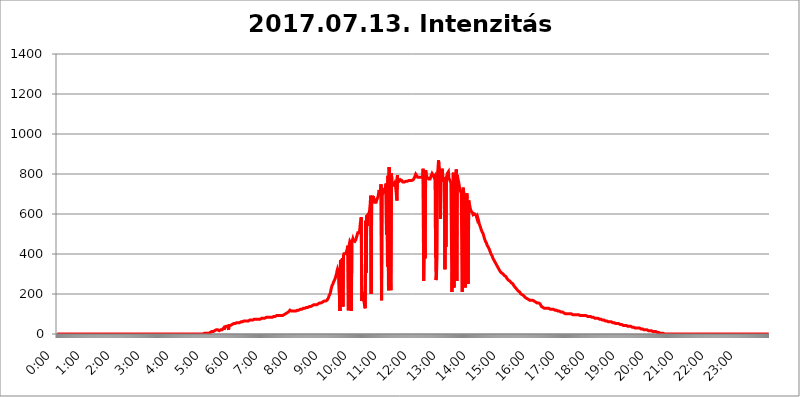
| Category | 2017.07.13. Intenzitás [W/m^2] |
|---|---|
| 0.0 | 0 |
| 0.0006944444444444445 | 0 |
| 0.001388888888888889 | 0 |
| 0.0020833333333333333 | 0 |
| 0.002777777777777778 | 0 |
| 0.003472222222222222 | 0 |
| 0.004166666666666667 | 0 |
| 0.004861111111111111 | 0 |
| 0.005555555555555556 | 0 |
| 0.0062499999999999995 | 0 |
| 0.006944444444444444 | 0 |
| 0.007638888888888889 | 0 |
| 0.008333333333333333 | 0 |
| 0.009027777777777779 | 0 |
| 0.009722222222222222 | 0 |
| 0.010416666666666666 | 0 |
| 0.011111111111111112 | 0 |
| 0.011805555555555555 | 0 |
| 0.012499999999999999 | 0 |
| 0.013194444444444444 | 0 |
| 0.013888888888888888 | 0 |
| 0.014583333333333332 | 0 |
| 0.015277777777777777 | 0 |
| 0.015972222222222224 | 0 |
| 0.016666666666666666 | 0 |
| 0.017361111111111112 | 0 |
| 0.018055555555555557 | 0 |
| 0.01875 | 0 |
| 0.019444444444444445 | 0 |
| 0.02013888888888889 | 0 |
| 0.020833333333333332 | 0 |
| 0.02152777777777778 | 0 |
| 0.022222222222222223 | 0 |
| 0.02291666666666667 | 0 |
| 0.02361111111111111 | 0 |
| 0.024305555555555556 | 0 |
| 0.024999999999999998 | 0 |
| 0.025694444444444447 | 0 |
| 0.02638888888888889 | 0 |
| 0.027083333333333334 | 0 |
| 0.027777777777777776 | 0 |
| 0.02847222222222222 | 0 |
| 0.029166666666666664 | 0 |
| 0.029861111111111113 | 0 |
| 0.030555555555555555 | 0 |
| 0.03125 | 0 |
| 0.03194444444444445 | 0 |
| 0.03263888888888889 | 0 |
| 0.03333333333333333 | 0 |
| 0.034027777777777775 | 0 |
| 0.034722222222222224 | 0 |
| 0.035416666666666666 | 0 |
| 0.036111111111111115 | 0 |
| 0.03680555555555556 | 0 |
| 0.0375 | 0 |
| 0.03819444444444444 | 0 |
| 0.03888888888888889 | 0 |
| 0.03958333333333333 | 0 |
| 0.04027777777777778 | 0 |
| 0.04097222222222222 | 0 |
| 0.041666666666666664 | 0 |
| 0.042361111111111106 | 0 |
| 0.04305555555555556 | 0 |
| 0.043750000000000004 | 0 |
| 0.044444444444444446 | 0 |
| 0.04513888888888889 | 0 |
| 0.04583333333333334 | 0 |
| 0.04652777777777778 | 0 |
| 0.04722222222222222 | 0 |
| 0.04791666666666666 | 0 |
| 0.04861111111111111 | 0 |
| 0.049305555555555554 | 0 |
| 0.049999999999999996 | 0 |
| 0.05069444444444445 | 0 |
| 0.051388888888888894 | 0 |
| 0.052083333333333336 | 0 |
| 0.05277777777777778 | 0 |
| 0.05347222222222222 | 0 |
| 0.05416666666666667 | 0 |
| 0.05486111111111111 | 0 |
| 0.05555555555555555 | 0 |
| 0.05625 | 0 |
| 0.05694444444444444 | 0 |
| 0.057638888888888885 | 0 |
| 0.05833333333333333 | 0 |
| 0.05902777777777778 | 0 |
| 0.059722222222222225 | 0 |
| 0.06041666666666667 | 0 |
| 0.061111111111111116 | 0 |
| 0.06180555555555556 | 0 |
| 0.0625 | 0 |
| 0.06319444444444444 | 0 |
| 0.06388888888888888 | 0 |
| 0.06458333333333334 | 0 |
| 0.06527777777777778 | 0 |
| 0.06597222222222222 | 0 |
| 0.06666666666666667 | 0 |
| 0.06736111111111111 | 0 |
| 0.06805555555555555 | 0 |
| 0.06874999999999999 | 0 |
| 0.06944444444444443 | 0 |
| 0.07013888888888889 | 0 |
| 0.07083333333333333 | 0 |
| 0.07152777777777779 | 0 |
| 0.07222222222222223 | 0 |
| 0.07291666666666667 | 0 |
| 0.07361111111111111 | 0 |
| 0.07430555555555556 | 0 |
| 0.075 | 0 |
| 0.07569444444444444 | 0 |
| 0.0763888888888889 | 0 |
| 0.07708333333333334 | 0 |
| 0.07777777777777778 | 0 |
| 0.07847222222222222 | 0 |
| 0.07916666666666666 | 0 |
| 0.0798611111111111 | 0 |
| 0.08055555555555556 | 0 |
| 0.08125 | 0 |
| 0.08194444444444444 | 0 |
| 0.08263888888888889 | 0 |
| 0.08333333333333333 | 0 |
| 0.08402777777777777 | 0 |
| 0.08472222222222221 | 0 |
| 0.08541666666666665 | 0 |
| 0.08611111111111112 | 0 |
| 0.08680555555555557 | 0 |
| 0.08750000000000001 | 0 |
| 0.08819444444444445 | 0 |
| 0.08888888888888889 | 0 |
| 0.08958333333333333 | 0 |
| 0.09027777777777778 | 0 |
| 0.09097222222222222 | 0 |
| 0.09166666666666667 | 0 |
| 0.09236111111111112 | 0 |
| 0.09305555555555556 | 0 |
| 0.09375 | 0 |
| 0.09444444444444444 | 0 |
| 0.09513888888888888 | 0 |
| 0.09583333333333333 | 0 |
| 0.09652777777777777 | 0 |
| 0.09722222222222222 | 0 |
| 0.09791666666666667 | 0 |
| 0.09861111111111111 | 0 |
| 0.09930555555555555 | 0 |
| 0.09999999999999999 | 0 |
| 0.10069444444444443 | 0 |
| 0.1013888888888889 | 0 |
| 0.10208333333333335 | 0 |
| 0.10277777777777779 | 0 |
| 0.10347222222222223 | 0 |
| 0.10416666666666667 | 0 |
| 0.10486111111111111 | 0 |
| 0.10555555555555556 | 0 |
| 0.10625 | 0 |
| 0.10694444444444444 | 0 |
| 0.1076388888888889 | 0 |
| 0.10833333333333334 | 0 |
| 0.10902777777777778 | 0 |
| 0.10972222222222222 | 0 |
| 0.1111111111111111 | 0 |
| 0.11180555555555556 | 0 |
| 0.11180555555555556 | 0 |
| 0.1125 | 0 |
| 0.11319444444444444 | 0 |
| 0.11388888888888889 | 0 |
| 0.11458333333333333 | 0 |
| 0.11527777777777777 | 0 |
| 0.11597222222222221 | 0 |
| 0.11666666666666665 | 0 |
| 0.1173611111111111 | 0 |
| 0.11805555555555557 | 0 |
| 0.11944444444444445 | 0 |
| 0.12013888888888889 | 0 |
| 0.12083333333333333 | 0 |
| 0.12152777777777778 | 0 |
| 0.12222222222222223 | 0 |
| 0.12291666666666667 | 0 |
| 0.12291666666666667 | 0 |
| 0.12361111111111112 | 0 |
| 0.12430555555555556 | 0 |
| 0.125 | 0 |
| 0.12569444444444444 | 0 |
| 0.12638888888888888 | 0 |
| 0.12708333333333333 | 0 |
| 0.16875 | 0 |
| 0.12847222222222224 | 0 |
| 0.12916666666666668 | 0 |
| 0.12986111111111112 | 0 |
| 0.13055555555555556 | 0 |
| 0.13125 | 0 |
| 0.13194444444444445 | 0 |
| 0.1326388888888889 | 0 |
| 0.13333333333333333 | 0 |
| 0.13402777777777777 | 0 |
| 0.13402777777777777 | 0 |
| 0.13472222222222222 | 0 |
| 0.13541666666666666 | 0 |
| 0.1361111111111111 | 0 |
| 0.13749999999999998 | 0 |
| 0.13819444444444443 | 0 |
| 0.1388888888888889 | 0 |
| 0.13958333333333334 | 0 |
| 0.14027777777777778 | 0 |
| 0.14097222222222222 | 0 |
| 0.14166666666666666 | 0 |
| 0.1423611111111111 | 0 |
| 0.14305555555555557 | 0 |
| 0.14375000000000002 | 0 |
| 0.14444444444444446 | 0 |
| 0.1451388888888889 | 0 |
| 0.1451388888888889 | 0 |
| 0.14652777777777778 | 0 |
| 0.14722222222222223 | 0 |
| 0.14791666666666667 | 0 |
| 0.1486111111111111 | 0 |
| 0.14930555555555555 | 0 |
| 0.15 | 0 |
| 0.15069444444444444 | 0 |
| 0.15138888888888888 | 0 |
| 0.15208333333333332 | 0 |
| 0.15277777777777776 | 0 |
| 0.15347222222222223 | 0 |
| 0.15416666666666667 | 0 |
| 0.15486111111111112 | 0 |
| 0.15555555555555556 | 0 |
| 0.15625 | 0 |
| 0.15694444444444444 | 0 |
| 0.15763888888888888 | 0 |
| 0.15833333333333333 | 0 |
| 0.15902777777777777 | 0 |
| 0.15972222222222224 | 0 |
| 0.16041666666666668 | 0 |
| 0.16111111111111112 | 0 |
| 0.16180555555555556 | 0 |
| 0.1625 | 0 |
| 0.16319444444444445 | 0 |
| 0.1638888888888889 | 0 |
| 0.16458333333333333 | 0 |
| 0.16527777777777777 | 0 |
| 0.16597222222222222 | 0 |
| 0.16666666666666666 | 0 |
| 0.1673611111111111 | 0 |
| 0.16805555555555554 | 0 |
| 0.16874999999999998 | 0 |
| 0.16944444444444443 | 0 |
| 0.17013888888888887 | 0 |
| 0.1708333333333333 | 0 |
| 0.17152777777777775 | 0 |
| 0.17222222222222225 | 0 |
| 0.1729166666666667 | 0 |
| 0.17361111111111113 | 0 |
| 0.17430555555555557 | 0 |
| 0.17500000000000002 | 0 |
| 0.17569444444444446 | 0 |
| 0.1763888888888889 | 0 |
| 0.17708333333333334 | 0 |
| 0.17777777777777778 | 0 |
| 0.17847222222222223 | 0 |
| 0.17916666666666667 | 0 |
| 0.1798611111111111 | 0 |
| 0.18055555555555555 | 0 |
| 0.18125 | 0 |
| 0.18194444444444444 | 0 |
| 0.1826388888888889 | 0 |
| 0.18333333333333335 | 0 |
| 0.1840277777777778 | 0 |
| 0.18472222222222223 | 0 |
| 0.18541666666666667 | 0 |
| 0.18611111111111112 | 0 |
| 0.18680555555555556 | 0 |
| 0.1875 | 0 |
| 0.18819444444444444 | 0 |
| 0.18888888888888888 | 0 |
| 0.18958333333333333 | 0 |
| 0.19027777777777777 | 0 |
| 0.1909722222222222 | 0 |
| 0.19166666666666665 | 0 |
| 0.19236111111111112 | 0 |
| 0.19305555555555554 | 0 |
| 0.19375 | 0 |
| 0.19444444444444445 | 0 |
| 0.1951388888888889 | 0 |
| 0.19583333333333333 | 0 |
| 0.19652777777777777 | 0 |
| 0.19722222222222222 | 0 |
| 0.19791666666666666 | 0 |
| 0.1986111111111111 | 0 |
| 0.19930555555555554 | 0 |
| 0.19999999999999998 | 0 |
| 0.20069444444444443 | 0 |
| 0.20138888888888887 | 0 |
| 0.2020833333333333 | 0 |
| 0.2027777777777778 | 0 |
| 0.2034722222222222 | 0 |
| 0.2041666666666667 | 0 |
| 0.20486111111111113 | 0 |
| 0.20555555555555557 | 3.525 |
| 0.20625000000000002 | 3.525 |
| 0.20694444444444446 | 3.525 |
| 0.2076388888888889 | 3.525 |
| 0.20833333333333334 | 3.525 |
| 0.20902777777777778 | 3.525 |
| 0.20972222222222223 | 3.525 |
| 0.21041666666666667 | 3.525 |
| 0.2111111111111111 | 3.525 |
| 0.21180555555555555 | 3.525 |
| 0.2125 | 3.525 |
| 0.21319444444444444 | 7.887 |
| 0.2138888888888889 | 7.887 |
| 0.21458333333333335 | 7.887 |
| 0.2152777777777778 | 7.887 |
| 0.21597222222222223 | 12.257 |
| 0.21666666666666667 | 12.257 |
| 0.21736111111111112 | 12.257 |
| 0.21805555555555556 | 12.257 |
| 0.21875 | 12.257 |
| 0.21944444444444444 | 16.636 |
| 0.22013888888888888 | 16.636 |
| 0.22083333333333333 | 16.636 |
| 0.22152777777777777 | 21.024 |
| 0.2222222222222222 | 21.024 |
| 0.22291666666666665 | 21.024 |
| 0.2236111111111111 | 21.024 |
| 0.22430555555555556 | 21.024 |
| 0.225 | 21.024 |
| 0.22569444444444445 | 16.636 |
| 0.2263888888888889 | 16.636 |
| 0.22708333333333333 | 16.636 |
| 0.22777777777777777 | 16.636 |
| 0.22847222222222222 | 16.636 |
| 0.22916666666666666 | 21.024 |
| 0.2298611111111111 | 16.636 |
| 0.23055555555555554 | 16.636 |
| 0.23124999999999998 | 21.024 |
| 0.23194444444444443 | 21.024 |
| 0.23263888888888887 | 21.024 |
| 0.2333333333333333 | 29.823 |
| 0.2340277777777778 | 21.024 |
| 0.2347222222222222 | 34.234 |
| 0.2354166666666667 | 29.823 |
| 0.23611111111111113 | 29.823 |
| 0.23680555555555557 | 38.653 |
| 0.23750000000000002 | 38.653 |
| 0.23819444444444446 | 38.653 |
| 0.2388888888888889 | 38.653 |
| 0.23958333333333334 | 38.653 |
| 0.24027777777777778 | 21.024 |
| 0.24097222222222223 | 43.079 |
| 0.24166666666666667 | 43.079 |
| 0.2423611111111111 | 47.511 |
| 0.24305555555555555 | 43.079 |
| 0.24375 | 47.511 |
| 0.24444444444444446 | 47.511 |
| 0.24513888888888888 | 47.511 |
| 0.24583333333333335 | 47.511 |
| 0.2465277777777778 | 47.511 |
| 0.24722222222222223 | 51.951 |
| 0.24791666666666667 | 51.951 |
| 0.24861111111111112 | 51.951 |
| 0.24930555555555556 | 51.951 |
| 0.25 | 51.951 |
| 0.25069444444444444 | 56.398 |
| 0.2513888888888889 | 56.398 |
| 0.2520833333333333 | 56.398 |
| 0.25277777777777777 | 56.398 |
| 0.2534722222222222 | 56.398 |
| 0.25416666666666665 | 56.398 |
| 0.2548611111111111 | 56.398 |
| 0.2555555555555556 | 56.398 |
| 0.25625000000000003 | 60.85 |
| 0.2569444444444445 | 60.85 |
| 0.2576388888888889 | 60.85 |
| 0.25833333333333336 | 60.85 |
| 0.2590277777777778 | 60.85 |
| 0.25972222222222224 | 60.85 |
| 0.2604166666666667 | 65.31 |
| 0.2611111111111111 | 65.31 |
| 0.26180555555555557 | 65.31 |
| 0.2625 | 65.31 |
| 0.26319444444444445 | 65.31 |
| 0.2638888888888889 | 65.31 |
| 0.26458333333333334 | 65.31 |
| 0.2652777777777778 | 65.31 |
| 0.2659722222222222 | 65.31 |
| 0.26666666666666666 | 65.31 |
| 0.2673611111111111 | 65.31 |
| 0.26805555555555555 | 65.31 |
| 0.26875 | 65.31 |
| 0.26944444444444443 | 65.31 |
| 0.2701388888888889 | 69.775 |
| 0.2708333333333333 | 69.775 |
| 0.27152777777777776 | 69.775 |
| 0.2722222222222222 | 69.775 |
| 0.27291666666666664 | 69.775 |
| 0.2736111111111111 | 69.775 |
| 0.2743055555555555 | 69.775 |
| 0.27499999999999997 | 69.775 |
| 0.27569444444444446 | 69.775 |
| 0.27638888888888885 | 74.246 |
| 0.27708333333333335 | 74.246 |
| 0.2777777777777778 | 74.246 |
| 0.27847222222222223 | 74.246 |
| 0.2791666666666667 | 74.246 |
| 0.2798611111111111 | 74.246 |
| 0.28055555555555556 | 74.246 |
| 0.28125 | 74.246 |
| 0.28194444444444444 | 74.246 |
| 0.2826388888888889 | 74.246 |
| 0.2833333333333333 | 74.246 |
| 0.28402777777777777 | 74.246 |
| 0.2847222222222222 | 74.246 |
| 0.28541666666666665 | 78.722 |
| 0.28611111111111115 | 78.722 |
| 0.28680555555555554 | 78.722 |
| 0.28750000000000003 | 78.722 |
| 0.2881944444444445 | 78.722 |
| 0.2888888888888889 | 78.722 |
| 0.28958333333333336 | 78.722 |
| 0.2902777777777778 | 78.722 |
| 0.29097222222222224 | 78.722 |
| 0.2916666666666667 | 78.722 |
| 0.2923611111111111 | 83.205 |
| 0.29305555555555557 | 83.205 |
| 0.29375 | 83.205 |
| 0.29444444444444445 | 83.205 |
| 0.2951388888888889 | 83.205 |
| 0.29583333333333334 | 83.205 |
| 0.2965277777777778 | 83.205 |
| 0.2972222222222222 | 83.205 |
| 0.29791666666666666 | 83.205 |
| 0.2986111111111111 | 83.205 |
| 0.29930555555555555 | 83.205 |
| 0.3 | 83.205 |
| 0.30069444444444443 | 83.205 |
| 0.3013888888888889 | 83.205 |
| 0.3020833333333333 | 87.692 |
| 0.30277777777777776 | 83.205 |
| 0.3034722222222222 | 87.692 |
| 0.30416666666666664 | 87.692 |
| 0.3048611111111111 | 87.692 |
| 0.3055555555555555 | 87.692 |
| 0.30624999999999997 | 87.692 |
| 0.3069444444444444 | 92.184 |
| 0.3076388888888889 | 92.184 |
| 0.30833333333333335 | 92.184 |
| 0.3090277777777778 | 92.184 |
| 0.30972222222222223 | 92.184 |
| 0.3104166666666667 | 92.184 |
| 0.3111111111111111 | 92.184 |
| 0.31180555555555556 | 92.184 |
| 0.3125 | 92.184 |
| 0.31319444444444444 | 92.184 |
| 0.3138888888888889 | 92.184 |
| 0.3145833333333333 | 92.184 |
| 0.31527777777777777 | 96.682 |
| 0.3159722222222222 | 92.184 |
| 0.31666666666666665 | 96.682 |
| 0.31736111111111115 | 96.682 |
| 0.31805555555555554 | 96.682 |
| 0.31875000000000003 | 101.184 |
| 0.3194444444444445 | 101.184 |
| 0.3201388888888889 | 101.184 |
| 0.32083333333333336 | 101.184 |
| 0.3215277777777778 | 105.69 |
| 0.32222222222222224 | 105.69 |
| 0.3229166666666667 | 105.69 |
| 0.3236111111111111 | 110.201 |
| 0.32430555555555557 | 110.201 |
| 0.325 | 110.201 |
| 0.32569444444444445 | 110.201 |
| 0.3263888888888889 | 119.235 |
| 0.32708333333333334 | 123.758 |
| 0.3277777777777778 | 123.758 |
| 0.3284722222222222 | 114.716 |
| 0.32916666666666666 | 114.716 |
| 0.3298611111111111 | 114.716 |
| 0.33055555555555555 | 114.716 |
| 0.33125 | 114.716 |
| 0.33194444444444443 | 114.716 |
| 0.3326388888888889 | 114.716 |
| 0.3333333333333333 | 114.716 |
| 0.3340277777777778 | 114.716 |
| 0.3347222222222222 | 114.716 |
| 0.3354166666666667 | 119.235 |
| 0.3361111111111111 | 119.235 |
| 0.3368055555555556 | 119.235 |
| 0.33749999999999997 | 119.235 |
| 0.33819444444444446 | 119.235 |
| 0.33888888888888885 | 119.235 |
| 0.33958333333333335 | 119.235 |
| 0.34027777777777773 | 123.758 |
| 0.34097222222222223 | 123.758 |
| 0.3416666666666666 | 123.758 |
| 0.3423611111111111 | 123.758 |
| 0.3430555555555555 | 123.758 |
| 0.34375 | 128.284 |
| 0.3444444444444445 | 128.284 |
| 0.3451388888888889 | 128.284 |
| 0.3458333333333334 | 128.284 |
| 0.34652777777777777 | 128.284 |
| 0.34722222222222227 | 128.284 |
| 0.34791666666666665 | 128.284 |
| 0.34861111111111115 | 132.814 |
| 0.34930555555555554 | 132.814 |
| 0.35000000000000003 | 132.814 |
| 0.3506944444444444 | 132.814 |
| 0.3513888888888889 | 132.814 |
| 0.3520833333333333 | 137.347 |
| 0.3527777777777778 | 137.347 |
| 0.3534722222222222 | 137.347 |
| 0.3541666666666667 | 137.347 |
| 0.3548611111111111 | 137.347 |
| 0.35555555555555557 | 137.347 |
| 0.35625 | 141.884 |
| 0.35694444444444445 | 141.884 |
| 0.3576388888888889 | 141.884 |
| 0.35833333333333334 | 141.884 |
| 0.3590277777777778 | 146.423 |
| 0.3597222222222222 | 146.423 |
| 0.36041666666666666 | 146.423 |
| 0.3611111111111111 | 146.423 |
| 0.36180555555555555 | 146.423 |
| 0.3625 | 146.423 |
| 0.36319444444444443 | 146.423 |
| 0.3638888888888889 | 146.423 |
| 0.3645833333333333 | 150.964 |
| 0.3652777777777778 | 150.964 |
| 0.3659722222222222 | 150.964 |
| 0.3666666666666667 | 155.509 |
| 0.3673611111111111 | 150.964 |
| 0.3680555555555556 | 155.509 |
| 0.36874999999999997 | 155.509 |
| 0.36944444444444446 | 155.509 |
| 0.37013888888888885 | 155.509 |
| 0.37083333333333335 | 160.056 |
| 0.37152777777777773 | 160.056 |
| 0.37222222222222223 | 160.056 |
| 0.3729166666666666 | 160.056 |
| 0.3736111111111111 | 160.056 |
| 0.3743055555555555 | 164.605 |
| 0.375 | 164.605 |
| 0.3756944444444445 | 164.605 |
| 0.3763888888888889 | 164.605 |
| 0.3770833333333334 | 164.605 |
| 0.37777777777777777 | 169.156 |
| 0.37847222222222227 | 169.156 |
| 0.37916666666666665 | 169.156 |
| 0.37986111111111115 | 173.709 |
| 0.38055555555555554 | 182.82 |
| 0.38125000000000003 | 191.937 |
| 0.3819444444444444 | 191.937 |
| 0.3826388888888889 | 201.058 |
| 0.3833333333333333 | 210.182 |
| 0.3840277777777778 | 223.873 |
| 0.3847222222222222 | 233 |
| 0.3854166666666667 | 242.127 |
| 0.3861111111111111 | 242.127 |
| 0.38680555555555557 | 251.251 |
| 0.3875 | 260.373 |
| 0.38819444444444445 | 264.932 |
| 0.3888888888888889 | 269.49 |
| 0.38958333333333334 | 274.047 |
| 0.3902777777777778 | 283.156 |
| 0.3909722222222222 | 287.709 |
| 0.39166666666666666 | 301.354 |
| 0.3923611111111111 | 314.98 |
| 0.39305555555555555 | 324.052 |
| 0.39375 | 314.98 |
| 0.39444444444444443 | 328.584 |
| 0.3951388888888889 | 328.584 |
| 0.3958333333333333 | 328.584 |
| 0.3965277777777778 | 114.716 |
| 0.3972222222222222 | 364.728 |
| 0.3979166666666667 | 364.728 |
| 0.3986111111111111 | 360.221 |
| 0.3993055555555556 | 369.23 |
| 0.39999999999999997 | 378.224 |
| 0.40069444444444446 | 137.347 |
| 0.40138888888888885 | 391.685 |
| 0.40208333333333335 | 400.638 |
| 0.40277777777777773 | 396.164 |
| 0.40347222222222223 | 396.164 |
| 0.4041666666666666 | 400.638 |
| 0.4048611111111111 | 405.108 |
| 0.4055555555555555 | 409.574 |
| 0.40625 | 414.035 |
| 0.4069444444444445 | 414.035 |
| 0.4076388888888889 | 440.702 |
| 0.4083333333333334 | 119.235 |
| 0.40902777777777777 | 436.27 |
| 0.40972222222222227 | 449.551 |
| 0.41041666666666665 | 462.786 |
| 0.41111111111111115 | 462.786 |
| 0.41180555555555554 | 453.968 |
| 0.41250000000000003 | 114.716 |
| 0.4131944444444444 | 458.38 |
| 0.4138888888888889 | 467.187 |
| 0.4145833333333333 | 475.972 |
| 0.4152777777777778 | 467.187 |
| 0.4159722222222222 | 462.786 |
| 0.4166666666666667 | 462.786 |
| 0.4173611111111111 | 462.786 |
| 0.41805555555555557 | 467.187 |
| 0.41875 | 471.582 |
| 0.41944444444444445 | 475.972 |
| 0.4201388888888889 | 475.972 |
| 0.42083333333333334 | 497.836 |
| 0.4215277777777778 | 506.542 |
| 0.4222222222222222 | 510.885 |
| 0.42291666666666666 | 506.542 |
| 0.4236111111111111 | 506.542 |
| 0.42430555555555555 | 523.88 |
| 0.425 | 553.986 |
| 0.42569444444444443 | 566.793 |
| 0.4263888888888889 | 583.779 |
| 0.4270833333333333 | 164.605 |
| 0.4277777777777778 | 187.378 |
| 0.4284722222222222 | 210.182 |
| 0.4291666666666667 | 196.497 |
| 0.4298611111111111 | 173.709 |
| 0.4305555555555556 | 155.509 |
| 0.43124999999999997 | 137.347 |
| 0.43194444444444446 | 128.284 |
| 0.43263888888888885 | 566.793 |
| 0.43333333333333335 | 305.898 |
| 0.43402777777777773 | 592.233 |
| 0.43472222222222223 | 541.121 |
| 0.4354166666666666 | 596.45 |
| 0.4361111111111111 | 596.45 |
| 0.4368055555555555 | 600.661 |
| 0.4375 | 604.864 |
| 0.4381944444444445 | 621.613 |
| 0.4388888888888889 | 650.667 |
| 0.4395833333333334 | 691.608 |
| 0.44027777777777777 | 201.058 |
| 0.44097222222222227 | 667.123 |
| 0.44166666666666665 | 691.608 |
| 0.44236111111111115 | 654.791 |
| 0.44305555555555554 | 687.544 |
| 0.44375000000000003 | 683.473 |
| 0.4444444444444444 | 671.22 |
| 0.4451388888888889 | 658.909 |
| 0.4458333333333333 | 658.909 |
| 0.4465277777777778 | 658.909 |
| 0.4472222222222222 | 658.909 |
| 0.4479166666666667 | 663.019 |
| 0.4486111111111111 | 675.311 |
| 0.44930555555555557 | 679.395 |
| 0.45 | 687.544 |
| 0.45069444444444445 | 703.762 |
| 0.4513888888888889 | 719.877 |
| 0.45208333333333334 | 711.832 |
| 0.4527777777777778 | 719.877 |
| 0.4534722222222222 | 695.666 |
| 0.45416666666666666 | 747.834 |
| 0.4548611111111111 | 169.156 |
| 0.45555555555555555 | 727.896 |
| 0.45625 | 715.858 |
| 0.45694444444444443 | 711.832 |
| 0.4576388888888889 | 707.8 |
| 0.4583333333333333 | 707.8 |
| 0.4590277777777778 | 719.877 |
| 0.4597222222222222 | 723.889 |
| 0.4604166666666667 | 735.89 |
| 0.4611111111111111 | 751.803 |
| 0.4618055555555556 | 497.836 |
| 0.46249999999999997 | 751.803 |
| 0.46319444444444446 | 337.639 |
| 0.46388888888888885 | 791.169 |
| 0.46458333333333335 | 219.309 |
| 0.46527777777777773 | 833.834 |
| 0.46597222222222223 | 822.26 |
| 0.4666666666666666 | 287.709 |
| 0.4673611111111111 | 260.373 |
| 0.4680555555555555 | 219.309 |
| 0.46875 | 802.868 |
| 0.4694444444444445 | 755.766 |
| 0.4701388888888889 | 747.834 |
| 0.4708333333333334 | 743.859 |
| 0.47152777777777777 | 743.859 |
| 0.47222222222222227 | 743.859 |
| 0.47291666666666665 | 743.859 |
| 0.47361111111111115 | 755.766 |
| 0.47430555555555554 | 747.834 |
| 0.47500000000000003 | 751.803 |
| 0.4756944444444444 | 751.803 |
| 0.4763888888888889 | 667.123 |
| 0.4770833333333333 | 795.074 |
| 0.4777777777777778 | 759.723 |
| 0.4784722222222222 | 759.723 |
| 0.4791666666666667 | 759.723 |
| 0.4798611111111111 | 763.674 |
| 0.48055555555555557 | 767.62 |
| 0.48125 | 771.559 |
| 0.48194444444444445 | 771.559 |
| 0.4826388888888889 | 767.62 |
| 0.48333333333333334 | 767.62 |
| 0.4840277777777778 | 763.674 |
| 0.4847222222222222 | 759.723 |
| 0.48541666666666666 | 759.723 |
| 0.4861111111111111 | 759.723 |
| 0.48680555555555555 | 759.723 |
| 0.4875 | 759.723 |
| 0.48819444444444443 | 763.674 |
| 0.4888888888888889 | 763.674 |
| 0.4895833333333333 | 763.674 |
| 0.4902777777777778 | 767.62 |
| 0.4909722222222222 | 763.674 |
| 0.4916666666666667 | 767.62 |
| 0.4923611111111111 | 767.62 |
| 0.4930555555555556 | 767.62 |
| 0.49374999999999997 | 767.62 |
| 0.49444444444444446 | 767.62 |
| 0.49513888888888885 | 767.62 |
| 0.49583333333333335 | 767.62 |
| 0.49652777777777773 | 767.62 |
| 0.49722222222222223 | 767.62 |
| 0.4979166666666666 | 767.62 |
| 0.4986111111111111 | 767.62 |
| 0.4993055555555555 | 771.559 |
| 0.5 | 775.492 |
| 0.5006944444444444 | 779.42 |
| 0.5013888888888889 | 775.492 |
| 0.5020833333333333 | 783.342 |
| 0.5027777777777778 | 798.974 |
| 0.5034722222222222 | 795.074 |
| 0.5041666666666667 | 791.169 |
| 0.5048611111111111 | 787.258 |
| 0.5055555555555555 | 783.342 |
| 0.50625 | 783.342 |
| 0.5069444444444444 | 783.342 |
| 0.5076388888888889 | 783.342 |
| 0.5083333333333333 | 783.342 |
| 0.5090277777777777 | 779.42 |
| 0.5097222222222222 | 783.342 |
| 0.5104166666666666 | 779.42 |
| 0.5111111111111112 | 779.42 |
| 0.5118055555555555 | 783.342 |
| 0.5125000000000001 | 791.169 |
| 0.5131944444444444 | 826.123 |
| 0.513888888888889 | 264.932 |
| 0.5145833333333333 | 436.27 |
| 0.5152777777777778 | 497.836 |
| 0.5159722222222222 | 378.224 |
| 0.5166666666666667 | 818.392 |
| 0.517361111111111 | 798.974 |
| 0.5180555555555556 | 791.169 |
| 0.5187499999999999 | 783.342 |
| 0.5194444444444445 | 779.42 |
| 0.5201388888888888 | 779.42 |
| 0.5208333333333334 | 775.492 |
| 0.5215277777777778 | 775.492 |
| 0.5222222222222223 | 775.492 |
| 0.5229166666666667 | 775.492 |
| 0.5236111111111111 | 779.42 |
| 0.5243055555555556 | 791.169 |
| 0.525 | 795.074 |
| 0.5256944444444445 | 802.868 |
| 0.5263888888888889 | 798.974 |
| 0.5270833333333333 | 795.074 |
| 0.5277777777777778 | 791.169 |
| 0.5284722222222222 | 783.342 |
| 0.5291666666666667 | 779.42 |
| 0.5298611111111111 | 791.169 |
| 0.5305555555555556 | 409.574 |
| 0.53125 | 269.49 |
| 0.5319444444444444 | 296.808 |
| 0.5326388888888889 | 387.202 |
| 0.5333333333333333 | 795.074 |
| 0.5340277777777778 | 829.981 |
| 0.5347222222222222 | 868.305 |
| 0.5354166666666667 | 849.199 |
| 0.5361111111111111 | 822.26 |
| 0.5368055555555555 | 806.757 |
| 0.5375 | 575.299 |
| 0.5381944444444444 | 802.868 |
| 0.5388888888888889 | 759.723 |
| 0.5395833333333333 | 826.123 |
| 0.5402777777777777 | 806.757 |
| 0.5409722222222222 | 783.342 |
| 0.5416666666666666 | 775.492 |
| 0.5423611111111112 | 767.62 |
| 0.5430555555555555 | 783.342 |
| 0.5437500000000001 | 324.052 |
| 0.5444444444444444 | 775.492 |
| 0.545138888888889 | 436.27 |
| 0.5458333333333333 | 783.342 |
| 0.5465277777777778 | 791.169 |
| 0.5472222222222222 | 802.868 |
| 0.5479166666666667 | 798.974 |
| 0.548611111111111 | 810.641 |
| 0.5493055555555556 | 779.42 |
| 0.5499999999999999 | 775.492 |
| 0.5506944444444445 | 767.62 |
| 0.5513888888888888 | 763.674 |
| 0.5520833333333334 | 755.766 |
| 0.5527777777777778 | 751.803 |
| 0.5534722222222223 | 210.182 |
| 0.5541666666666667 | 305.898 |
| 0.5548611111111111 | 260.373 |
| 0.5555555555555556 | 806.757 |
| 0.55625 | 233 |
| 0.5569444444444445 | 246.689 |
| 0.5576388888888889 | 791.169 |
| 0.5583333333333333 | 795.074 |
| 0.5590277777777778 | 278.603 |
| 0.5597222222222222 | 822.26 |
| 0.5604166666666667 | 264.932 |
| 0.5611111111111111 | 795.074 |
| 0.5618055555555556 | 775.492 |
| 0.5625 | 767.62 |
| 0.5631944444444444 | 755.766 |
| 0.5638888888888889 | 739.877 |
| 0.5645833333333333 | 723.889 |
| 0.5652777777777778 | 715.858 |
| 0.5659722222222222 | 711.832 |
| 0.5666666666666667 | 703.762 |
| 0.5673611111111111 | 405.108 |
| 0.5680555555555555 | 210.182 |
| 0.56875 | 719.877 |
| 0.5694444444444444 | 731.896 |
| 0.5701388888888889 | 703.762 |
| 0.5708333333333333 | 691.608 |
| 0.5715277777777777 | 683.473 |
| 0.5722222222222222 | 233 |
| 0.5729166666666666 | 396.164 |
| 0.5736111111111112 | 445.129 |
| 0.5743055555555555 | 703.762 |
| 0.5750000000000001 | 679.395 |
| 0.5756944444444444 | 675.311 |
| 0.576388888888889 | 251.251 |
| 0.5770833333333333 | 667.123 |
| 0.5777777777777778 | 650.667 |
| 0.5784722222222222 | 642.4 |
| 0.5791666666666667 | 629.948 |
| 0.579861111111111 | 621.613 |
| 0.5805555555555556 | 613.252 |
| 0.5812499999999999 | 609.062 |
| 0.5819444444444445 | 609.062 |
| 0.5826388888888888 | 604.864 |
| 0.5833333333333334 | 596.45 |
| 0.5840277777777778 | 596.45 |
| 0.5847222222222223 | 596.45 |
| 0.5854166666666667 | 600.661 |
| 0.5861111111111111 | 600.661 |
| 0.5868055555555556 | 596.45 |
| 0.5875 | 592.233 |
| 0.5881944444444445 | 583.779 |
| 0.5888888888888889 | 575.299 |
| 0.5895833333333333 | 583.779 |
| 0.5902777777777778 | 579.542 |
| 0.5909722222222222 | 566.793 |
| 0.5916666666666667 | 553.986 |
| 0.5923611111111111 | 545.416 |
| 0.5930555555555556 | 541.121 |
| 0.59375 | 532.513 |
| 0.5944444444444444 | 523.88 |
| 0.5951388888888889 | 519.555 |
| 0.5958333333333333 | 510.885 |
| 0.5965277777777778 | 506.542 |
| 0.5972222222222222 | 502.192 |
| 0.5979166666666667 | 493.475 |
| 0.5986111111111111 | 489.108 |
| 0.5993055555555555 | 475.972 |
| 0.6 | 471.582 |
| 0.6006944444444444 | 462.786 |
| 0.6013888888888889 | 458.38 |
| 0.6020833333333333 | 453.968 |
| 0.6027777777777777 | 445.129 |
| 0.6034722222222222 | 440.702 |
| 0.6041666666666666 | 436.27 |
| 0.6048611111111112 | 431.833 |
| 0.6055555555555555 | 427.39 |
| 0.6062500000000001 | 422.943 |
| 0.6069444444444444 | 414.035 |
| 0.607638888888889 | 409.574 |
| 0.6083333333333333 | 400.638 |
| 0.6090277777777778 | 400.638 |
| 0.6097222222222222 | 391.685 |
| 0.6104166666666667 | 387.202 |
| 0.611111111111111 | 378.224 |
| 0.6118055555555556 | 373.729 |
| 0.6124999999999999 | 369.23 |
| 0.6131944444444445 | 364.728 |
| 0.6138888888888888 | 360.221 |
| 0.6145833333333334 | 355.712 |
| 0.6152777777777778 | 351.198 |
| 0.6159722222222223 | 346.682 |
| 0.6166666666666667 | 342.162 |
| 0.6173611111111111 | 337.639 |
| 0.6180555555555556 | 333.113 |
| 0.61875 | 328.584 |
| 0.6194444444444445 | 324.052 |
| 0.6201388888888889 | 324.052 |
| 0.6208333333333333 | 314.98 |
| 0.6215277777777778 | 314.98 |
| 0.6222222222222222 | 310.44 |
| 0.6229166666666667 | 305.898 |
| 0.6236111111111111 | 305.898 |
| 0.6243055555555556 | 305.898 |
| 0.625 | 301.354 |
| 0.6256944444444444 | 301.354 |
| 0.6263888888888889 | 296.808 |
| 0.6270833333333333 | 292.259 |
| 0.6277777777777778 | 292.259 |
| 0.6284722222222222 | 287.709 |
| 0.6291666666666667 | 287.709 |
| 0.6298611111111111 | 283.156 |
| 0.6305555555555555 | 278.603 |
| 0.63125 | 278.603 |
| 0.6319444444444444 | 274.047 |
| 0.6326388888888889 | 269.49 |
| 0.6333333333333333 | 269.49 |
| 0.6340277777777777 | 264.932 |
| 0.6347222222222222 | 264.932 |
| 0.6354166666666666 | 260.373 |
| 0.6361111111111112 | 260.373 |
| 0.6368055555555555 | 255.813 |
| 0.6375000000000001 | 251.251 |
| 0.6381944444444444 | 251.251 |
| 0.638888888888889 | 251.251 |
| 0.6395833333333333 | 246.689 |
| 0.6402777777777778 | 242.127 |
| 0.6409722222222222 | 237.564 |
| 0.6416666666666667 | 237.564 |
| 0.642361111111111 | 233 |
| 0.6430555555555556 | 228.436 |
| 0.6437499999999999 | 228.436 |
| 0.6444444444444445 | 223.873 |
| 0.6451388888888888 | 219.309 |
| 0.6458333333333334 | 219.309 |
| 0.6465277777777778 | 214.746 |
| 0.6472222222222223 | 214.746 |
| 0.6479166666666667 | 210.182 |
| 0.6486111111111111 | 210.182 |
| 0.6493055555555556 | 205.62 |
| 0.65 | 201.058 |
| 0.6506944444444445 | 201.058 |
| 0.6513888888888889 | 196.497 |
| 0.6520833333333333 | 196.497 |
| 0.6527777777777778 | 191.937 |
| 0.6534722222222222 | 191.937 |
| 0.6541666666666667 | 191.937 |
| 0.6548611111111111 | 187.378 |
| 0.6555555555555556 | 187.378 |
| 0.65625 | 182.82 |
| 0.6569444444444444 | 182.82 |
| 0.6576388888888889 | 182.82 |
| 0.6583333333333333 | 178.264 |
| 0.6590277777777778 | 178.264 |
| 0.6597222222222222 | 173.709 |
| 0.6604166666666667 | 173.709 |
| 0.6611111111111111 | 173.709 |
| 0.6618055555555555 | 173.709 |
| 0.6625 | 169.156 |
| 0.6631944444444444 | 169.156 |
| 0.6638888888888889 | 169.156 |
| 0.6645833333333333 | 169.156 |
| 0.6652777777777777 | 169.156 |
| 0.6659722222222222 | 169.156 |
| 0.6666666666666666 | 169.156 |
| 0.6673611111111111 | 164.605 |
| 0.6680555555555556 | 164.605 |
| 0.6687500000000001 | 164.605 |
| 0.6694444444444444 | 160.056 |
| 0.6701388888888888 | 160.056 |
| 0.6708333333333334 | 160.056 |
| 0.6715277777777778 | 160.056 |
| 0.6722222222222222 | 155.509 |
| 0.6729166666666666 | 155.509 |
| 0.6736111111111112 | 155.509 |
| 0.6743055555555556 | 155.509 |
| 0.6749999999999999 | 155.509 |
| 0.6756944444444444 | 155.509 |
| 0.6763888888888889 | 150.964 |
| 0.6770833333333334 | 150.964 |
| 0.6777777777777777 | 146.423 |
| 0.6784722222222223 | 146.423 |
| 0.6791666666666667 | 137.347 |
| 0.6798611111111111 | 132.814 |
| 0.6805555555555555 | 132.814 |
| 0.68125 | 132.814 |
| 0.6819444444444445 | 128.284 |
| 0.6826388888888889 | 128.284 |
| 0.6833333333333332 | 128.284 |
| 0.6840277777777778 | 128.284 |
| 0.6847222222222222 | 128.284 |
| 0.6854166666666667 | 128.284 |
| 0.686111111111111 | 128.284 |
| 0.6868055555555556 | 128.284 |
| 0.6875 | 128.284 |
| 0.6881944444444444 | 128.284 |
| 0.688888888888889 | 128.284 |
| 0.6895833333333333 | 128.284 |
| 0.6902777777777778 | 128.284 |
| 0.6909722222222222 | 123.758 |
| 0.6916666666666668 | 123.758 |
| 0.6923611111111111 | 123.758 |
| 0.6930555555555555 | 123.758 |
| 0.69375 | 123.758 |
| 0.6944444444444445 | 123.758 |
| 0.6951388888888889 | 123.758 |
| 0.6958333333333333 | 123.758 |
| 0.6965277777777777 | 123.758 |
| 0.6972222222222223 | 119.235 |
| 0.6979166666666666 | 119.235 |
| 0.6986111111111111 | 119.235 |
| 0.6993055555555556 | 119.235 |
| 0.7000000000000001 | 119.235 |
| 0.7006944444444444 | 119.235 |
| 0.7013888888888888 | 114.716 |
| 0.7020833333333334 | 114.716 |
| 0.7027777777777778 | 114.716 |
| 0.7034722222222222 | 114.716 |
| 0.7041666666666666 | 114.716 |
| 0.7048611111111112 | 114.716 |
| 0.7055555555555556 | 110.201 |
| 0.7062499999999999 | 110.201 |
| 0.7069444444444444 | 110.201 |
| 0.7076388888888889 | 110.201 |
| 0.7083333333333334 | 110.201 |
| 0.7090277777777777 | 105.69 |
| 0.7097222222222223 | 105.69 |
| 0.7104166666666667 | 105.69 |
| 0.7111111111111111 | 105.69 |
| 0.7118055555555555 | 101.184 |
| 0.7125 | 101.184 |
| 0.7131944444444445 | 101.184 |
| 0.7138888888888889 | 101.184 |
| 0.7145833333333332 | 101.184 |
| 0.7152777777777778 | 101.184 |
| 0.7159722222222222 | 101.184 |
| 0.7166666666666667 | 101.184 |
| 0.717361111111111 | 101.184 |
| 0.7180555555555556 | 101.184 |
| 0.71875 | 101.184 |
| 0.7194444444444444 | 101.184 |
| 0.720138888888889 | 101.184 |
| 0.7208333333333333 | 101.184 |
| 0.7215277777777778 | 96.682 |
| 0.7222222222222222 | 101.184 |
| 0.7229166666666668 | 96.682 |
| 0.7236111111111111 | 96.682 |
| 0.7243055555555555 | 96.682 |
| 0.725 | 96.682 |
| 0.7256944444444445 | 96.682 |
| 0.7263888888888889 | 96.682 |
| 0.7270833333333333 | 96.682 |
| 0.7277777777777777 | 96.682 |
| 0.7284722222222223 | 96.682 |
| 0.7291666666666666 | 96.682 |
| 0.7298611111111111 | 96.682 |
| 0.7305555555555556 | 96.682 |
| 0.7312500000000001 | 96.682 |
| 0.7319444444444444 | 96.682 |
| 0.7326388888888888 | 92.184 |
| 0.7333333333333334 | 92.184 |
| 0.7340277777777778 | 92.184 |
| 0.7347222222222222 | 92.184 |
| 0.7354166666666666 | 92.184 |
| 0.7361111111111112 | 92.184 |
| 0.7368055555555556 | 92.184 |
| 0.7374999999999999 | 92.184 |
| 0.7381944444444444 | 92.184 |
| 0.7388888888888889 | 92.184 |
| 0.7395833333333334 | 92.184 |
| 0.7402777777777777 | 92.184 |
| 0.7409722222222223 | 92.184 |
| 0.7416666666666667 | 92.184 |
| 0.7423611111111111 | 92.184 |
| 0.7430555555555555 | 87.692 |
| 0.74375 | 87.692 |
| 0.7444444444444445 | 87.692 |
| 0.7451388888888889 | 87.692 |
| 0.7458333333333332 | 87.692 |
| 0.7465277777777778 | 87.692 |
| 0.7472222222222222 | 87.692 |
| 0.7479166666666667 | 87.692 |
| 0.748611111111111 | 87.692 |
| 0.7493055555555556 | 87.692 |
| 0.75 | 83.205 |
| 0.7506944444444444 | 83.205 |
| 0.751388888888889 | 83.205 |
| 0.7520833333333333 | 83.205 |
| 0.7527777777777778 | 83.205 |
| 0.7534722222222222 | 83.205 |
| 0.7541666666666668 | 78.722 |
| 0.7548611111111111 | 78.722 |
| 0.7555555555555555 | 78.722 |
| 0.75625 | 78.722 |
| 0.7569444444444445 | 78.722 |
| 0.7576388888888889 | 78.722 |
| 0.7583333333333333 | 78.722 |
| 0.7590277777777777 | 74.246 |
| 0.7597222222222223 | 74.246 |
| 0.7604166666666666 | 74.246 |
| 0.7611111111111111 | 74.246 |
| 0.7618055555555556 | 74.246 |
| 0.7625000000000001 | 74.246 |
| 0.7631944444444444 | 74.246 |
| 0.7638888888888888 | 69.775 |
| 0.7645833333333334 | 69.775 |
| 0.7652777777777778 | 69.775 |
| 0.7659722222222222 | 69.775 |
| 0.7666666666666666 | 69.775 |
| 0.7673611111111112 | 69.775 |
| 0.7680555555555556 | 65.31 |
| 0.7687499999999999 | 65.31 |
| 0.7694444444444444 | 65.31 |
| 0.7701388888888889 | 65.31 |
| 0.7708333333333334 | 65.31 |
| 0.7715277777777777 | 65.31 |
| 0.7722222222222223 | 65.31 |
| 0.7729166666666667 | 60.85 |
| 0.7736111111111111 | 60.85 |
| 0.7743055555555555 | 60.85 |
| 0.775 | 60.85 |
| 0.7756944444444445 | 65.31 |
| 0.7763888888888889 | 60.85 |
| 0.7770833333333332 | 60.85 |
| 0.7777777777777778 | 56.398 |
| 0.7784722222222222 | 56.398 |
| 0.7791666666666667 | 56.398 |
| 0.779861111111111 | 56.398 |
| 0.7805555555555556 | 56.398 |
| 0.78125 | 56.398 |
| 0.7819444444444444 | 56.398 |
| 0.782638888888889 | 51.951 |
| 0.7833333333333333 | 51.951 |
| 0.7840277777777778 | 51.951 |
| 0.7847222222222222 | 51.951 |
| 0.7854166666666668 | 51.951 |
| 0.7861111111111111 | 51.951 |
| 0.7868055555555555 | 51.951 |
| 0.7875 | 51.951 |
| 0.7881944444444445 | 47.511 |
| 0.7888888888888889 | 47.511 |
| 0.7895833333333333 | 47.511 |
| 0.7902777777777777 | 47.511 |
| 0.7909722222222223 | 47.511 |
| 0.7916666666666666 | 47.511 |
| 0.7923611111111111 | 47.511 |
| 0.7930555555555556 | 43.079 |
| 0.7937500000000001 | 43.079 |
| 0.7944444444444444 | 43.079 |
| 0.7951388888888888 | 43.079 |
| 0.7958333333333334 | 43.079 |
| 0.7965277777777778 | 43.079 |
| 0.7972222222222222 | 43.079 |
| 0.7979166666666666 | 43.079 |
| 0.7986111111111112 | 38.653 |
| 0.7993055555555556 | 38.653 |
| 0.7999999999999999 | 38.653 |
| 0.8006944444444444 | 38.653 |
| 0.8013888888888889 | 38.653 |
| 0.8020833333333334 | 38.653 |
| 0.8027777777777777 | 38.653 |
| 0.8034722222222223 | 38.653 |
| 0.8041666666666667 | 38.653 |
| 0.8048611111111111 | 34.234 |
| 0.8055555555555555 | 34.234 |
| 0.80625 | 34.234 |
| 0.8069444444444445 | 34.234 |
| 0.8076388888888889 | 34.234 |
| 0.8083333333333332 | 34.234 |
| 0.8090277777777778 | 34.234 |
| 0.8097222222222222 | 34.234 |
| 0.8104166666666667 | 29.823 |
| 0.811111111111111 | 29.823 |
| 0.8118055555555556 | 29.823 |
| 0.8125 | 29.823 |
| 0.8131944444444444 | 29.823 |
| 0.813888888888889 | 29.823 |
| 0.8145833333333333 | 29.823 |
| 0.8152777777777778 | 29.823 |
| 0.8159722222222222 | 29.823 |
| 0.8166666666666668 | 29.823 |
| 0.8173611111111111 | 25.419 |
| 0.8180555555555555 | 25.419 |
| 0.81875 | 25.419 |
| 0.8194444444444445 | 25.419 |
| 0.8201388888888889 | 25.419 |
| 0.8208333333333333 | 25.419 |
| 0.8215277777777777 | 25.419 |
| 0.8222222222222223 | 25.419 |
| 0.8229166666666666 | 21.024 |
| 0.8236111111111111 | 21.024 |
| 0.8243055555555556 | 21.024 |
| 0.8250000000000001 | 21.024 |
| 0.8256944444444444 | 21.024 |
| 0.8263888888888888 | 21.024 |
| 0.8270833333333334 | 21.024 |
| 0.8277777777777778 | 21.024 |
| 0.8284722222222222 | 21.024 |
| 0.8291666666666666 | 16.636 |
| 0.8298611111111112 | 16.636 |
| 0.8305555555555556 | 16.636 |
| 0.8312499999999999 | 16.636 |
| 0.8319444444444444 | 16.636 |
| 0.8326388888888889 | 16.636 |
| 0.8333333333333334 | 16.636 |
| 0.8340277777777777 | 16.636 |
| 0.8347222222222223 | 12.257 |
| 0.8354166666666667 | 12.257 |
| 0.8361111111111111 | 12.257 |
| 0.8368055555555555 | 12.257 |
| 0.8375 | 12.257 |
| 0.8381944444444445 | 12.257 |
| 0.8388888888888889 | 12.257 |
| 0.8395833333333332 | 12.257 |
| 0.8402777777777778 | 7.887 |
| 0.8409722222222222 | 7.887 |
| 0.8416666666666667 | 7.887 |
| 0.842361111111111 | 7.887 |
| 0.8430555555555556 | 7.887 |
| 0.84375 | 7.887 |
| 0.8444444444444444 | 3.525 |
| 0.845138888888889 | 3.525 |
| 0.8458333333333333 | 3.525 |
| 0.8465277777777778 | 3.525 |
| 0.8472222222222222 | 3.525 |
| 0.8479166666666668 | 3.525 |
| 0.8486111111111111 | 3.525 |
| 0.8493055555555555 | 3.525 |
| 0.85 | 3.525 |
| 0.8506944444444445 | 3.525 |
| 0.8513888888888889 | 3.525 |
| 0.8520833333333333 | 0 |
| 0.8527777777777777 | 0 |
| 0.8534722222222223 | 0 |
| 0.8541666666666666 | 0 |
| 0.8548611111111111 | 0 |
| 0.8555555555555556 | 0 |
| 0.8562500000000001 | 0 |
| 0.8569444444444444 | 0 |
| 0.8576388888888888 | 0 |
| 0.8583333333333334 | 0 |
| 0.8590277777777778 | 0 |
| 0.8597222222222222 | 0 |
| 0.8604166666666666 | 0 |
| 0.8611111111111112 | 0 |
| 0.8618055555555556 | 0 |
| 0.8624999999999999 | 0 |
| 0.8631944444444444 | 0 |
| 0.8638888888888889 | 0 |
| 0.8645833333333334 | 0 |
| 0.8652777777777777 | 0 |
| 0.8659722222222223 | 0 |
| 0.8666666666666667 | 0 |
| 0.8673611111111111 | 0 |
| 0.8680555555555555 | 0 |
| 0.86875 | 0 |
| 0.8694444444444445 | 0 |
| 0.8701388888888889 | 0 |
| 0.8708333333333332 | 0 |
| 0.8715277777777778 | 0 |
| 0.8722222222222222 | 0 |
| 0.8729166666666667 | 0 |
| 0.873611111111111 | 0 |
| 0.8743055555555556 | 0 |
| 0.875 | 0 |
| 0.8756944444444444 | 0 |
| 0.876388888888889 | 0 |
| 0.8770833333333333 | 0 |
| 0.8777777777777778 | 0 |
| 0.8784722222222222 | 0 |
| 0.8791666666666668 | 0 |
| 0.8798611111111111 | 0 |
| 0.8805555555555555 | 0 |
| 0.88125 | 0 |
| 0.8819444444444445 | 0 |
| 0.8826388888888889 | 0 |
| 0.8833333333333333 | 0 |
| 0.8840277777777777 | 0 |
| 0.8847222222222223 | 0 |
| 0.8854166666666666 | 0 |
| 0.8861111111111111 | 0 |
| 0.8868055555555556 | 0 |
| 0.8875000000000001 | 0 |
| 0.8881944444444444 | 0 |
| 0.8888888888888888 | 0 |
| 0.8895833333333334 | 0 |
| 0.8902777777777778 | 0 |
| 0.8909722222222222 | 0 |
| 0.8916666666666666 | 0 |
| 0.8923611111111112 | 0 |
| 0.8930555555555556 | 0 |
| 0.8937499999999999 | 0 |
| 0.8944444444444444 | 0 |
| 0.8951388888888889 | 0 |
| 0.8958333333333334 | 0 |
| 0.8965277777777777 | 0 |
| 0.8972222222222223 | 0 |
| 0.8979166666666667 | 0 |
| 0.8986111111111111 | 0 |
| 0.8993055555555555 | 0 |
| 0.9 | 0 |
| 0.9006944444444445 | 0 |
| 0.9013888888888889 | 0 |
| 0.9020833333333332 | 0 |
| 0.9027777777777778 | 0 |
| 0.9034722222222222 | 0 |
| 0.9041666666666667 | 0 |
| 0.904861111111111 | 0 |
| 0.9055555555555556 | 0 |
| 0.90625 | 0 |
| 0.9069444444444444 | 0 |
| 0.907638888888889 | 0 |
| 0.9083333333333333 | 0 |
| 0.9090277777777778 | 0 |
| 0.9097222222222222 | 0 |
| 0.9104166666666668 | 0 |
| 0.9111111111111111 | 0 |
| 0.9118055555555555 | 0 |
| 0.9125 | 0 |
| 0.9131944444444445 | 0 |
| 0.9138888888888889 | 0 |
| 0.9145833333333333 | 0 |
| 0.9152777777777777 | 0 |
| 0.9159722222222223 | 0 |
| 0.9166666666666666 | 0 |
| 0.9173611111111111 | 0 |
| 0.9180555555555556 | 0 |
| 0.9187500000000001 | 0 |
| 0.9194444444444444 | 0 |
| 0.9201388888888888 | 0 |
| 0.9208333333333334 | 0 |
| 0.9215277777777778 | 0 |
| 0.9222222222222222 | 0 |
| 0.9229166666666666 | 0 |
| 0.9236111111111112 | 0 |
| 0.9243055555555556 | 0 |
| 0.9249999999999999 | 0 |
| 0.9256944444444444 | 0 |
| 0.9263888888888889 | 0 |
| 0.9270833333333334 | 0 |
| 0.9277777777777777 | 0 |
| 0.9284722222222223 | 0 |
| 0.9291666666666667 | 0 |
| 0.9298611111111111 | 0 |
| 0.9305555555555555 | 0 |
| 0.93125 | 0 |
| 0.9319444444444445 | 0 |
| 0.9326388888888889 | 0 |
| 0.9333333333333332 | 0 |
| 0.9340277777777778 | 0 |
| 0.9347222222222222 | 0 |
| 0.9354166666666667 | 0 |
| 0.936111111111111 | 0 |
| 0.9368055555555556 | 0 |
| 0.9375 | 0 |
| 0.9381944444444444 | 0 |
| 0.938888888888889 | 0 |
| 0.9395833333333333 | 0 |
| 0.9402777777777778 | 0 |
| 0.9409722222222222 | 0 |
| 0.9416666666666668 | 0 |
| 0.9423611111111111 | 0 |
| 0.9430555555555555 | 0 |
| 0.94375 | 0 |
| 0.9444444444444445 | 0 |
| 0.9451388888888889 | 0 |
| 0.9458333333333333 | 0 |
| 0.9465277777777777 | 0 |
| 0.9472222222222223 | 0 |
| 0.9479166666666666 | 0 |
| 0.9486111111111111 | 0 |
| 0.9493055555555556 | 0 |
| 0.9500000000000001 | 0 |
| 0.9506944444444444 | 0 |
| 0.9513888888888888 | 0 |
| 0.9520833333333334 | 0 |
| 0.9527777777777778 | 0 |
| 0.9534722222222222 | 0 |
| 0.9541666666666666 | 0 |
| 0.9548611111111112 | 0 |
| 0.9555555555555556 | 0 |
| 0.9562499999999999 | 0 |
| 0.9569444444444444 | 0 |
| 0.9576388888888889 | 0 |
| 0.9583333333333334 | 0 |
| 0.9590277777777777 | 0 |
| 0.9597222222222223 | 0 |
| 0.9604166666666667 | 0 |
| 0.9611111111111111 | 0 |
| 0.9618055555555555 | 0 |
| 0.9625 | 0 |
| 0.9631944444444445 | 0 |
| 0.9638888888888889 | 0 |
| 0.9645833333333332 | 0 |
| 0.9652777777777778 | 0 |
| 0.9659722222222222 | 0 |
| 0.9666666666666667 | 0 |
| 0.967361111111111 | 0 |
| 0.9680555555555556 | 0 |
| 0.96875 | 0 |
| 0.9694444444444444 | 0 |
| 0.970138888888889 | 0 |
| 0.9708333333333333 | 0 |
| 0.9715277777777778 | 0 |
| 0.9722222222222222 | 0 |
| 0.9729166666666668 | 0 |
| 0.9736111111111111 | 0 |
| 0.9743055555555555 | 0 |
| 0.975 | 0 |
| 0.9756944444444445 | 0 |
| 0.9763888888888889 | 0 |
| 0.9770833333333333 | 0 |
| 0.9777777777777777 | 0 |
| 0.9784722222222223 | 0 |
| 0.9791666666666666 | 0 |
| 0.9798611111111111 | 0 |
| 0.9805555555555556 | 0 |
| 0.9812500000000001 | 0 |
| 0.9819444444444444 | 0 |
| 0.9826388888888888 | 0 |
| 0.9833333333333334 | 0 |
| 0.9840277777777778 | 0 |
| 0.9847222222222222 | 0 |
| 0.9854166666666666 | 0 |
| 0.9861111111111112 | 0 |
| 0.9868055555555556 | 0 |
| 0.9874999999999999 | 0 |
| 0.9881944444444444 | 0 |
| 0.9888888888888889 | 0 |
| 0.9895833333333334 | 0 |
| 0.9902777777777777 | 0 |
| 0.9909722222222223 | 0 |
| 0.9916666666666667 | 0 |
| 0.9923611111111111 | 0 |
| 0.9930555555555555 | 0 |
| 0.99375 | 0 |
| 0.9944444444444445 | 0 |
| 0.9951388888888889 | 0 |
| 0.9958333333333332 | 0 |
| 0.9965277777777778 | 0 |
| 0.9972222222222222 | 0 |
| 0.9979166666666667 | 0 |
| 0.998611111111111 | 0 |
| 0.9993055555555556 | 0 |